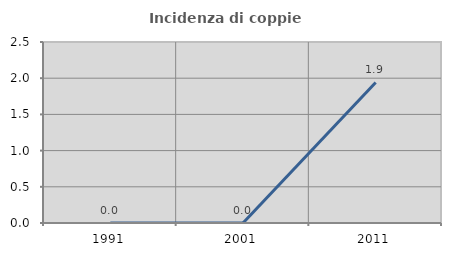
| Category | Incidenza di coppie miste |
|---|---|
| 1991.0 | 0 |
| 2001.0 | 0 |
| 2011.0 | 1.942 |